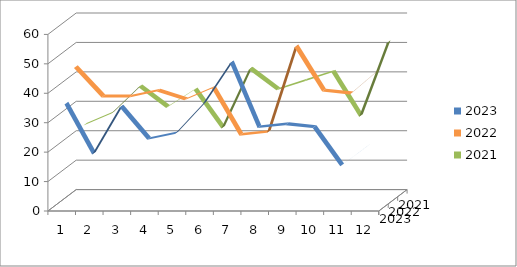
| Category | 2023 | 2022 | 2021 |
|---|---|---|---|
| 0 | 35 | 45 | 23 |
| 1 | 18 | 35 | 27 |
| 2 | 34 | 35 | 36 |
| 3 | 23 | 37 | 29 |
| 4 | 25 | 34 | 35 |
| 5 | 35 | 38 | 22 |
| 6 | 49 | 22 | 42 |
| 7 | 27 | 23 | 35 |
| 8 | 28 | 52 | 38 |
| 9 | 27 | 37 | 41 |
| 10 | 14 | 36 | 26 |
| 11 | 21 | 44 | 51 |